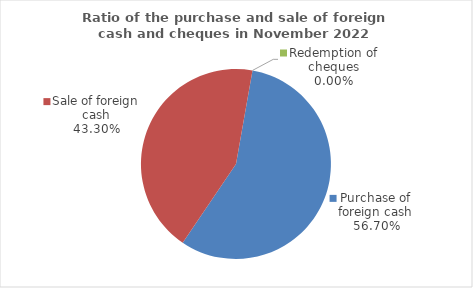
| Category | Series 0 |
|---|---|
| Purchase of foreign cash | 56.699 |
| Sale of foreign cash | 43.301 |
| Redemption of cheques | 0 |